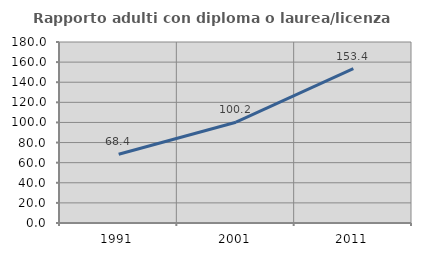
| Category | Rapporto adulti con diploma o laurea/licenza media  |
|---|---|
| 1991.0 | 68.367 |
| 2001.0 | 100.22 |
| 2011.0 | 153.432 |